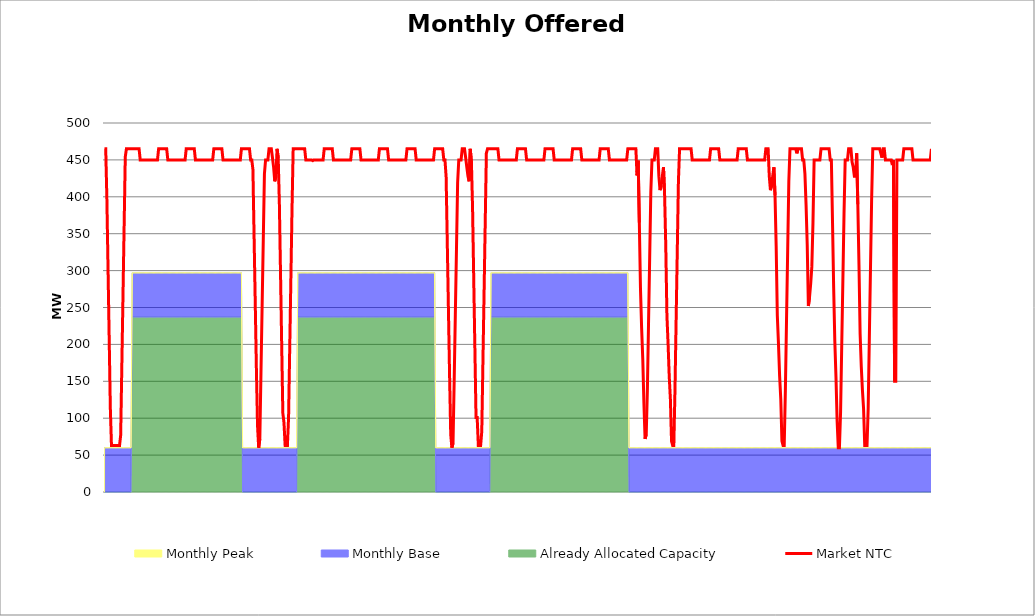
| Category | Market NTC |
|---|---|
| 0 | 465 |
| 1 | 465 |
| 2 | 397 |
| 3 | 303 |
| 4 | 209 |
| 5 | 114 |
| 6 | 63 |
| 7 | 63 |
| 8 | 63 |
| 9 | 63 |
| 10 | 63 |
| 11 | 63 |
| 12 | 63 |
| 13 | 63 |
| 14 | 77 |
| 15 | 171 |
| 16 | 265 |
| 17 | 360 |
| 18 | 454 |
| 19 | 465 |
| 20 | 465 |
| 21 | 465 |
| 22 | 465 |
| 23 | 465 |
| 24 | 465 |
| 25 | 465 |
| 26 | 465 |
| 27 | 465 |
| 28 | 465 |
| 29 | 465 |
| 30 | 465 |
| 31 | 450 |
| 32 | 450 |
| 33 | 450 |
| 34 | 450 |
| 35 | 450 |
| 36 | 450 |
| 37 | 450 |
| 38 | 450 |
| 39 | 450 |
| 40 | 450 |
| 41 | 450 |
| 42 | 450 |
| 43 | 450 |
| 44 | 450 |
| 45 | 450 |
| 46 | 450 |
| 47 | 465 |
| 48 | 465 |
| 49 | 465 |
| 50 | 465 |
| 51 | 465 |
| 52 | 465 |
| 53 | 465 |
| 54 | 465 |
| 55 | 450 |
| 56 | 450 |
| 57 | 450 |
| 58 | 450 |
| 59 | 450 |
| 60 | 450 |
| 61 | 450 |
| 62 | 450 |
| 63 | 450 |
| 64 | 450 |
| 65 | 450 |
| 66 | 450 |
| 67 | 450 |
| 68 | 450 |
| 69 | 450 |
| 70 | 450 |
| 71 | 465 |
| 72 | 465 |
| 73 | 465 |
| 74 | 465 |
| 75 | 465 |
| 76 | 465 |
| 77 | 465 |
| 78 | 465 |
| 79 | 450 |
| 80 | 450 |
| 81 | 450 |
| 82 | 450 |
| 83 | 450 |
| 84 | 450 |
| 85 | 450 |
| 86 | 450 |
| 87 | 450 |
| 88 | 450 |
| 89 | 450 |
| 90 | 450 |
| 91 | 450 |
| 92 | 450 |
| 93 | 450 |
| 94 | 450 |
| 95 | 465 |
| 96 | 465 |
| 97 | 465 |
| 98 | 465 |
| 99 | 465 |
| 100 | 465 |
| 101 | 465 |
| 102 | 465 |
| 103 | 450 |
| 104 | 450 |
| 105 | 450 |
| 106 | 450 |
| 107 | 450 |
| 108 | 450 |
| 109 | 450 |
| 110 | 450 |
| 111 | 450 |
| 112 | 450 |
| 113 | 450 |
| 114 | 450 |
| 115 | 450 |
| 116 | 450 |
| 117 | 450 |
| 118 | 450 |
| 119 | 465 |
| 120 | 465 |
| 121 | 465 |
| 122 | 465 |
| 123 | 465 |
| 124 | 465 |
| 125 | 465 |
| 126 | 465 |
| 127 | 450 |
| 128 | 450 |
| 129 | 437 |
| 130 | 347 |
| 131 | 258 |
| 132 | 168 |
| 133 | 90 |
| 134 | 60 |
| 135 | 72 |
| 136 | 162 |
| 137 | 252 |
| 138 | 341 |
| 139 | 431 |
| 140 | 450 |
| 141 | 450 |
| 142 | 450 |
| 143 | 465 |
| 144 | 465 |
| 145 | 465 |
| 146 | 453 |
| 147 | 440 |
| 148 | 421 |
| 149 | 428 |
| 150 | 465 |
| 151 | 453 |
| 152 | 390 |
| 153 | 296 |
| 154 | 201 |
| 155 | 107 |
| 156 | 94 |
| 157 | 63 |
| 158 | 63 |
| 159 | 63 |
| 160 | 101 |
| 161 | 195 |
| 162 | 289 |
| 163 | 384 |
| 164 | 465 |
| 165 | 465 |
| 166 | 465 |
| 167 | 465 |
| 168 | 465 |
| 169 | 465 |
| 170 | 465 |
| 171 | 465 |
| 172 | 465 |
| 173 | 465 |
| 174 | 465 |
| 175 | 450 |
| 176 | 450 |
| 177 | 450 |
| 178 | 450 |
| 179 | 450 |
| 180 | 450 |
| 181 | 449 |
| 182 | 450 |
| 183 | 450 |
| 184 | 450 |
| 185 | 450 |
| 186 | 450 |
| 187 | 450 |
| 188 | 450 |
| 189 | 450 |
| 190 | 450 |
| 191 | 465 |
| 192 | 465 |
| 193 | 465 |
| 194 | 465 |
| 195 | 465 |
| 196 | 465 |
| 197 | 465 |
| 198 | 465 |
| 199 | 450 |
| 200 | 450 |
| 201 | 450 |
| 202 | 450 |
| 203 | 450 |
| 204 | 450 |
| 205 | 450 |
| 206 | 450 |
| 207 | 450 |
| 208 | 450 |
| 209 | 450 |
| 210 | 450 |
| 211 | 450 |
| 212 | 450 |
| 213 | 450 |
| 214 | 450 |
| 215 | 465 |
| 216 | 465 |
| 217 | 465 |
| 218 | 465 |
| 219 | 465 |
| 220 | 465 |
| 221 | 465 |
| 222 | 465 |
| 223 | 450 |
| 224 | 450 |
| 225 | 450 |
| 226 | 450 |
| 227 | 450 |
| 228 | 450 |
| 229 | 450 |
| 230 | 450 |
| 231 | 450 |
| 232 | 450 |
| 233 | 450 |
| 234 | 450 |
| 235 | 450 |
| 236 | 450 |
| 237 | 450 |
| 238 | 450 |
| 239 | 465 |
| 240 | 465 |
| 241 | 465 |
| 242 | 465 |
| 243 | 465 |
| 244 | 465 |
| 245 | 465 |
| 246 | 465 |
| 247 | 450 |
| 248 | 450 |
| 249 | 450 |
| 250 | 450 |
| 251 | 450 |
| 252 | 450 |
| 253 | 450 |
| 254 | 450 |
| 255 | 450 |
| 256 | 450 |
| 257 | 450 |
| 258 | 450 |
| 259 | 450 |
| 260 | 450 |
| 261 | 450 |
| 262 | 450 |
| 263 | 465 |
| 264 | 465 |
| 265 | 465 |
| 266 | 465 |
| 267 | 465 |
| 268 | 465 |
| 269 | 465 |
| 270 | 465 |
| 271 | 450 |
| 272 | 450 |
| 273 | 450 |
| 274 | 450 |
| 275 | 450 |
| 276 | 450 |
| 277 | 450 |
| 278 | 450 |
| 279 | 450 |
| 280 | 450 |
| 281 | 450 |
| 282 | 450 |
| 283 | 450 |
| 284 | 450 |
| 285 | 450 |
| 286 | 450 |
| 287 | 465 |
| 288 | 465 |
| 289 | 465 |
| 290 | 465 |
| 291 | 465 |
| 292 | 465 |
| 293 | 465 |
| 294 | 465 |
| 295 | 450 |
| 296 | 450 |
| 297 | 427 |
| 298 | 338 |
| 299 | 248 |
| 300 | 158 |
| 301 | 78 |
| 302 | 60 |
| 303 | 66 |
| 304 | 150 |
| 305 | 240 |
| 306 | 329 |
| 307 | 419 |
| 308 | 450 |
| 309 | 450 |
| 310 | 450 |
| 311 | 465 |
| 312 | 465 |
| 313 | 465 |
| 314 | 453 |
| 315 | 440 |
| 316 | 428 |
| 317 | 421 |
| 318 | 465 |
| 319 | 447 |
| 320 | 384 |
| 321 | 289 |
| 322 | 195 |
| 323 | 101 |
| 324 | 101 |
| 325 | 63 |
| 326 | 63 |
| 327 | 63 |
| 328 | 82 |
| 329 | 176 |
| 330 | 270 |
| 331 | 365 |
| 332 | 459 |
| 333 | 465 |
| 334 | 465 |
| 335 | 465 |
| 336 | 465 |
| 337 | 465 |
| 338 | 465 |
| 339 | 465 |
| 340 | 465 |
| 341 | 465 |
| 342 | 465 |
| 343 | 450 |
| 344 | 450 |
| 345 | 450 |
| 346 | 450 |
| 347 | 450 |
| 348 | 450 |
| 349 | 450 |
| 350 | 450 |
| 351 | 450 |
| 352 | 450 |
| 353 | 450 |
| 354 | 450 |
| 355 | 450 |
| 356 | 450 |
| 357 | 450 |
| 358 | 450 |
| 359 | 465 |
| 360 | 465 |
| 361 | 465 |
| 362 | 465 |
| 363 | 465 |
| 364 | 465 |
| 365 | 465 |
| 366 | 465 |
| 367 | 450 |
| 368 | 450 |
| 369 | 450 |
| 370 | 450 |
| 371 | 450 |
| 372 | 450 |
| 373 | 450 |
| 374 | 450 |
| 375 | 450 |
| 376 | 450 |
| 377 | 450 |
| 378 | 450 |
| 379 | 450 |
| 380 | 450 |
| 381 | 450 |
| 382 | 450 |
| 383 | 465 |
| 384 | 465 |
| 385 | 465 |
| 386 | 465 |
| 387 | 465 |
| 388 | 465 |
| 389 | 465 |
| 390 | 465 |
| 391 | 450 |
| 392 | 450 |
| 393 | 450 |
| 394 | 450 |
| 395 | 450 |
| 396 | 450 |
| 397 | 450 |
| 398 | 450 |
| 399 | 450 |
| 400 | 450 |
| 401 | 450 |
| 402 | 450 |
| 403 | 450 |
| 404 | 450 |
| 405 | 450 |
| 406 | 450 |
| 407 | 465 |
| 408 | 465 |
| 409 | 465 |
| 410 | 465 |
| 411 | 465 |
| 412 | 465 |
| 413 | 465 |
| 414 | 465 |
| 415 | 450 |
| 416 | 450 |
| 417 | 450 |
| 418 | 450 |
| 419 | 450 |
| 420 | 450 |
| 421 | 450 |
| 422 | 450 |
| 423 | 450 |
| 424 | 450 |
| 425 | 450 |
| 426 | 450 |
| 427 | 450 |
| 428 | 450 |
| 429 | 450 |
| 430 | 450 |
| 431 | 465 |
| 432 | 465 |
| 433 | 465 |
| 434 | 465 |
| 435 | 465 |
| 436 | 465 |
| 437 | 465 |
| 438 | 465 |
| 439 | 450 |
| 440 | 450 |
| 441 | 450 |
| 442 | 450 |
| 443 | 450 |
| 444 | 450 |
| 445 | 450 |
| 446 | 450 |
| 447 | 450 |
| 448 | 450 |
| 449 | 450 |
| 450 | 450 |
| 451 | 450 |
| 452 | 450 |
| 453 | 450 |
| 454 | 450 |
| 455 | 465 |
| 456 | 465 |
| 457 | 465 |
| 458 | 465 |
| 459 | 465 |
| 460 | 465 |
| 461 | 465 |
| 462 | 465 |
| 463 | 429 |
| 464 | 449 |
| 465 | 365 |
| 466 | 276 |
| 467 | 222 |
| 468 | 180 |
| 469 | 120 |
| 470 | 72 |
| 471 | 78 |
| 472 | 138 |
| 473 | 228 |
| 474 | 317 |
| 475 | 407 |
| 476 | 450 |
| 477 | 450 |
| 478 | 450 |
| 479 | 465 |
| 480 | 465 |
| 481 | 465 |
| 482 | 428 |
| 483 | 409 |
| 484 | 415 |
| 485 | 428 |
| 486 | 440 |
| 487 | 402 |
| 488 | 333 |
| 489 | 239 |
| 490 | 201 |
| 491 | 157 |
| 492 | 126 |
| 493 | 69 |
| 494 | 63 |
| 495 | 63 |
| 496 | 138 |
| 497 | 233 |
| 498 | 327 |
| 499 | 421 |
| 500 | 465 |
| 501 | 465 |
| 502 | 465 |
| 503 | 465 |
| 504 | 465 |
| 505 | 465 |
| 506 | 465 |
| 507 | 465 |
| 508 | 465 |
| 509 | 465 |
| 510 | 465 |
| 511 | 450 |
| 512 | 450 |
| 513 | 450 |
| 514 | 450 |
| 515 | 450 |
| 516 | 450 |
| 517 | 450 |
| 518 | 450 |
| 519 | 450 |
| 520 | 450 |
| 521 | 450 |
| 522 | 450 |
| 523 | 450 |
| 524 | 450 |
| 525 | 450 |
| 526 | 450 |
| 527 | 465 |
| 528 | 465 |
| 529 | 465 |
| 530 | 465 |
| 531 | 465 |
| 532 | 465 |
| 533 | 465 |
| 534 | 465 |
| 535 | 450 |
| 536 | 450 |
| 537 | 450 |
| 538 | 450 |
| 539 | 450 |
| 540 | 450 |
| 541 | 450 |
| 542 | 450 |
| 543 | 450 |
| 544 | 450 |
| 545 | 450 |
| 546 | 450 |
| 547 | 450 |
| 548 | 450 |
| 549 | 450 |
| 550 | 450 |
| 551 | 465 |
| 552 | 465 |
| 553 | 465 |
| 554 | 465 |
| 555 | 465 |
| 556 | 465 |
| 557 | 465 |
| 558 | 465 |
| 559 | 450 |
| 560 | 450 |
| 561 | 450 |
| 562 | 450 |
| 563 | 450 |
| 564 | 450 |
| 565 | 450 |
| 566 | 450 |
| 567 | 450 |
| 568 | 450 |
| 569 | 450 |
| 570 | 450 |
| 571 | 450 |
| 572 | 450 |
| 573 | 450 |
| 574 | 450 |
| 575 | 465 |
| 576 | 465 |
| 577 | 465 |
| 578 | 428 |
| 579 | 409 |
| 580 | 415 |
| 581 | 428 |
| 582 | 440 |
| 583 | 402 |
| 584 | 333 |
| 585 | 239 |
| 586 | 201 |
| 587 | 157 |
| 588 | 126 |
| 589 | 69 |
| 590 | 63 |
| 591 | 63 |
| 592 | 138 |
| 593 | 233 |
| 594 | 327 |
| 595 | 421 |
| 596 | 465 |
| 597 | 465 |
| 598 | 465 |
| 599 | 465 |
| 600 | 465 |
| 601 | 465 |
| 602 | 459 |
| 603 | 465 |
| 604 | 465 |
| 605 | 465 |
| 606 | 465 |
| 607 | 450 |
| 608 | 450 |
| 609 | 431 |
| 610 | 389 |
| 611 | 335 |
| 612 | 252 |
| 613 | 264 |
| 614 | 282 |
| 615 | 305 |
| 616 | 365 |
| 617 | 450 |
| 618 | 450 |
| 619 | 450 |
| 620 | 450 |
| 621 | 450 |
| 622 | 450 |
| 623 | 465 |
| 624 | 465 |
| 625 | 465 |
| 626 | 465 |
| 627 | 465 |
| 628 | 465 |
| 629 | 465 |
| 630 | 465 |
| 631 | 450 |
| 632 | 450 |
| 633 | 365 |
| 634 | 276 |
| 635 | 204 |
| 636 | 156 |
| 637 | 96 |
| 638 | 60 |
| 639 | 60 |
| 640 | 108 |
| 641 | 198 |
| 642 | 287 |
| 643 | 377 |
| 644 | 450 |
| 645 | 450 |
| 646 | 450 |
| 647 | 465 |
| 648 | 465 |
| 649 | 465 |
| 650 | 447 |
| 651 | 440 |
| 652 | 428 |
| 653 | 428 |
| 654 | 459 |
| 655 | 390 |
| 656 | 308 |
| 657 | 214 |
| 658 | 170 |
| 659 | 138 |
| 660 | 113 |
| 661 | 63 |
| 662 | 63 |
| 663 | 63 |
| 664 | 113 |
| 665 | 208 |
| 666 | 302 |
| 667 | 396 |
| 668 | 465 |
| 669 | 465 |
| 670 | 465 |
| 671 | 465 |
| 672 | 465 |
| 673 | 465 |
| 674 | 465 |
| 675 | 459 |
| 676 | 453 |
| 677 | 465 |
| 678 | 465 |
| 679 | 450 |
| 680 | 450 |
| 681 | 450 |
| 682 | 450 |
| 683 | 450 |
| 684 | 450 |
| 685 | 443 |
| 686 | 450 |
| 687 | 150 |
| 688 | 150 |
| 689 | 450 |
| 690 | 450 |
| 691 | 450 |
| 692 | 450 |
| 693 | 450 |
| 694 | 450 |
| 695 | 465 |
| 696 | 465 |
| 697 | 465 |
| 698 | 465 |
| 699 | 465 |
| 700 | 465 |
| 701 | 465 |
| 702 | 465 |
| 703 | 450 |
| 704 | 450 |
| 705 | 450 |
| 706 | 450 |
| 707 | 450 |
| 708 | 450 |
| 709 | 450 |
| 710 | 450 |
| 711 | 450 |
| 712 | 450 |
| 713 | 450 |
| 714 | 450 |
| 715 | 450 |
| 716 | 450 |
| 717 | 450 |
| 718 | 450 |
| 719 | 465 |